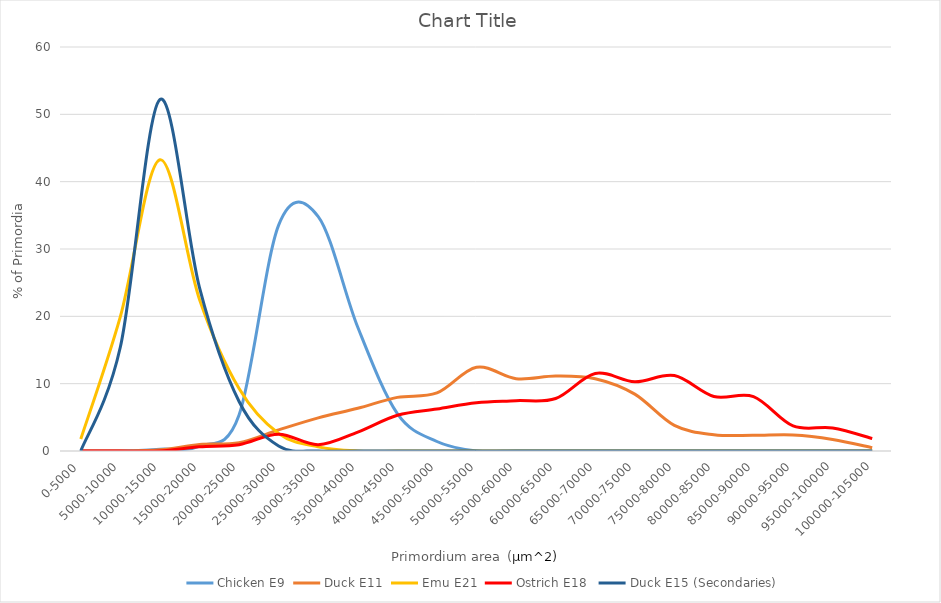
| Category | Chicken E9 | Duck E11 | Emu E21 | Ostrich E18  | Duck E15 (Secondaries) |
|---|---|---|---|---|---|
| 0-5000 | 0 | 0 | 1.776 | 0 | 0 |
| 5000-10000 | 0 | 0 | 19.964 | 0 | 15.441 |
| 10000-15000 | 0.263 | 0.177 | 43.245 | 0 | 52.206 |
| 15000-20000 | 0.711 | 0.962 | 22.517 | 0.625 | 24.265 |
| 20000-25000 | 5.33 | 1.231 | 9.28 | 0.938 | 7.353 |
| 25000-30000 | 33.539 | 3.133 | 2.603 | 2.498 | 0.735 |
| 30000-35000 | 34.819 | 4.923 | 0.616 | 0.938 | 0 |
| 35000-40000 | 18.375 | 6.354 | 0 | 2.811 | 0 |
| 40000-45000 | 5.551 | 7.965 | 0 | 5.309 | 0 |
| 45000-50000 | 1.413 | 8.62 | 0 | 6.24 | 0 |
| 50000-55000 | 0 | 12.436 | 0 | 7.18 | 0 |
| 55000-60000 | 0 | 10.737 | 0 | 7.479 | 0 |
| 60000-65000 | 0 | 11.134 | 0 | 7.795 | 0 |
| 65000-70000 | 0 | 10.74 | 0 | 11.514 | 0 |
| 70000-75000 | 0 | 8.448 | 0 | 10.274 | 0 |
| 75000-80000 | 0 | 3.801 | 0 | 11.201 | 0 |
| 80000-85000 | 0 | 2.419 | 0 | 8.096 | 0 |
| 85000-90000 | 0 | 2.322 | 0 | 8.082 | 0 |
| 90000-95000 | 0 | 2.375 | 0 | 3.733 | 0 |
| 95000-100000 | 0 | 1.719 | 0 | 3.424 | 0 |
| 100000-105000 | 0 | 0.505 | 0 | 1.865 | 0 |